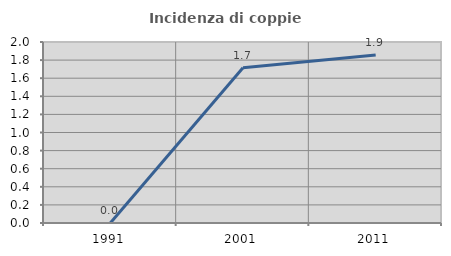
| Category | Incidenza di coppie miste |
|---|---|
| 1991.0 | 0 |
| 2001.0 | 1.716 |
| 2011.0 | 1.856 |